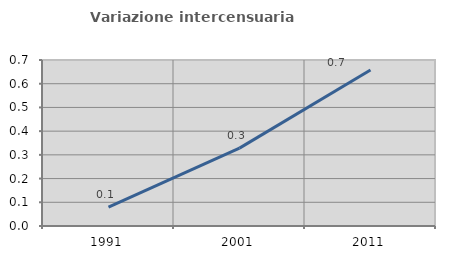
| Category | Variazione intercensuaria annua |
|---|---|
| 1991.0 | 0.08 |
| 2001.0 | 0.328 |
| 2011.0 | 0.658 |